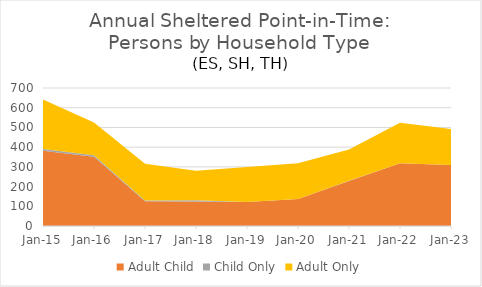
| Category | Adult Child | Child Only | Adult Only |
|---|---|---|---|
| 2015-01-28 | 382 | 8 | 252 |
| 2016-01-27 | 351 | 8 | 166 |
| 2017-01-25 | 126 | 3 | 187 |
| 2018-01-25 | 124 | 6 | 150 |
| 2019-01-23 | 122 | 0 | 177 |
| 2020-01-22 | 137 | 0 | 181 |
| 2021-01-27 | 228 | 1 | 159 |
| 2022-01-26 | 318 | 0 | 206 |
| 2023-01-25 | 310 | 0 | 182 |